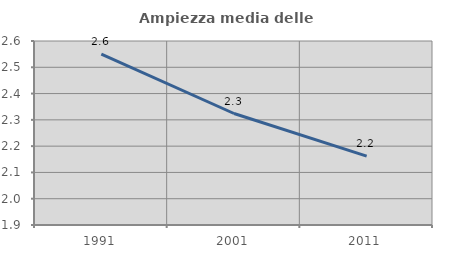
| Category | Ampiezza media delle famiglie |
|---|---|
| 1991.0 | 2.55 |
| 2001.0 | 2.324 |
| 2011.0 | 2.162 |